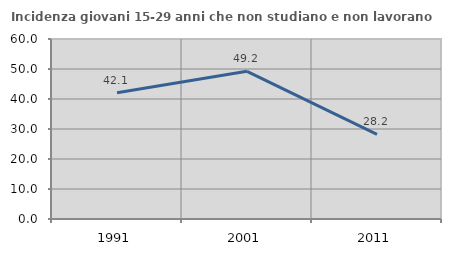
| Category | Incidenza giovani 15-29 anni che non studiano e non lavorano  |
|---|---|
| 1991.0 | 42.077 |
| 2001.0 | 49.231 |
| 2011.0 | 28.188 |